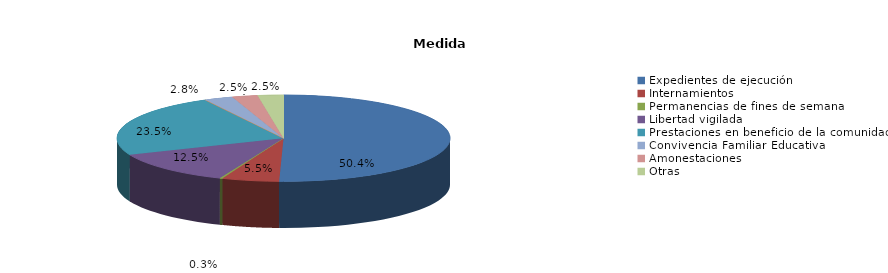
| Category | Series 0 |
|---|---|
| Expedientes de ejecución | 182 |
| Internamientos | 20 |
| Permanencias de fines de semana | 1 |
| Libertad vigilada | 45 |
| Prestaciones en beneficio de la comunidad | 85 |
| Privación de permisos y licencias | 0 |
| Convivencia Familiar Educativa | 10 |
| Amonestaciones | 9 |
| Otras | 9 |